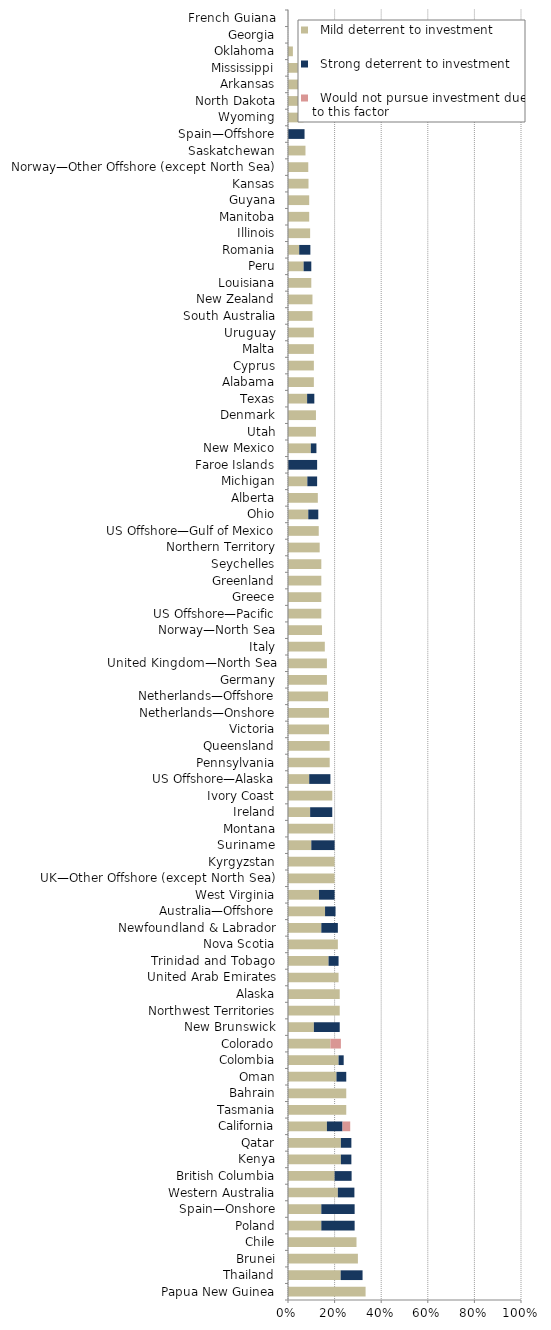
| Category |   Mild deterrent to investment |   Strong deterrent to investment |   Would not pursue investment due to this factor |
|---|---|---|---|
| Papua New Guinea | 0.333 | 0 | 0 |
| Thailand | 0.226 | 0.094 | 0 |
| Brunei | 0.3 | 0 | 0 |
| Chile | 0.294 | 0 | 0 |
| Poland | 0.143 | 0.143 | 0 |
| Spain—Onshore | 0.143 | 0.143 | 0 |
| Western Australia | 0.214 | 0.071 | 0 |
| British Columbia | 0.2 | 0.073 | 0 |
| Kenya | 0.227 | 0.045 | 0 |
| Qatar | 0.227 | 0.045 | 0 |
| California | 0.167 | 0.067 | 0.033 |
| Tasmania | 0.25 | 0 | 0 |
| Bahrain | 0.25 | 0 | 0 |
| Oman | 0.208 | 0.042 | 0 |
| Colombia | 0.217 | 0.022 | 0 |
| Colorado | 0.182 | 0 | 0.045 |
| New Brunswick | 0.111 | 0.111 | 0 |
| Northwest Territories | 0.222 | 0 | 0 |
| Alaska | 0.222 | 0 | 0 |
| United Arab Emirates | 0.217 | 0 | 0 |
| Trinidad and Tobago | 0.174 | 0.043 | 0 |
| Nova Scotia | 0.214 | 0 | 0 |
| Newfoundland & Labrador | 0.143 | 0.071 | 0 |
| Australia—Offshore | 0.159 | 0.045 | 0 |
| West Virginia | 0.133 | 0.067 | 0 |
| UK—Other Offshore (except North Sea) | 0.2 | 0 | 0 |
| Kyrgyzstan | 0.2 | 0 | 0 |
| Suriname | 0.1 | 0.1 | 0 |
| Montana | 0.194 | 0 | 0 |
| Ireland | 0.095 | 0.095 | 0 |
| Ivory Coast | 0.19 | 0 | 0 |
| US Offshore—Alaska | 0.091 | 0.091 | 0 |
| Pennsylvania | 0.179 | 0 | 0 |
| Queensland | 0.179 | 0 | 0 |
| Victoria | 0.176 | 0 | 0 |
| Netherlands—Onshore | 0.176 | 0 | 0 |
| Netherlands—Offshore | 0.172 | 0 | 0 |
| Germany | 0.167 | 0 | 0 |
| United Kingdom—North Sea | 0.167 | 0 | 0 |
| Italy | 0.158 | 0 | 0 |
| Norway—North Sea | 0.146 | 0 | 0 |
| US Offshore—Pacific | 0.143 | 0 | 0 |
| Greece | 0.143 | 0 | 0 |
| Greenland | 0.143 | 0 | 0 |
| Seychelles | 0.143 | 0 | 0 |
| Northern Territory | 0.136 | 0 | 0 |
| US Offshore—Gulf of Mexico | 0.132 | 0 | 0 |
| Ohio | 0.087 | 0.043 | 0 |
| Alberta | 0.128 | 0 | 0 |
| Michigan | 0.083 | 0.042 | 0 |
| Faroe Islands | 0 | 0.125 | 0 |
| New Mexico | 0.098 | 0.024 | 0 |
| Utah | 0.12 | 0 | 0 |
| Denmark | 0.12 | 0 | 0 |
| Texas | 0.082 | 0.031 | 0 |
| Alabama | 0.111 | 0 | 0 |
| Cyprus | 0.111 | 0 | 0 |
| Malta | 0.111 | 0 | 0 |
| Uruguay | 0.111 | 0 | 0 |
| South Australia | 0.105 | 0 | 0 |
| New Zealand | 0.105 | 0 | 0 |
| Louisiana | 0.1 | 0 | 0 |
| Peru | 0.067 | 0.033 | 0 |
| Romania | 0.048 | 0.048 | 0 |
| Illinois | 0.095 | 0 | 0 |
| Manitoba | 0.091 | 0 | 0 |
| Guyana | 0.091 | 0 | 0 |
| Kansas | 0.088 | 0 | 0 |
| Norway—Other Offshore (except North Sea) | 0.087 | 0 | 0 |
| Saskatchewan | 0.075 | 0 | 0 |
| Spain—Offshore | 0 | 0.071 | 0 |
| Wyoming | 0.067 | 0 | 0 |
| North Dakota | 0.063 | 0 | 0 |
| Arkansas | 0.048 | 0 | 0 |
| Mississippi | 0.042 | 0 | 0 |
| Oklahoma | 0.021 | 0 | 0 |
| Georgia | 0 | 0 | 0 |
| French Guiana | 0 | 0 | 0 |